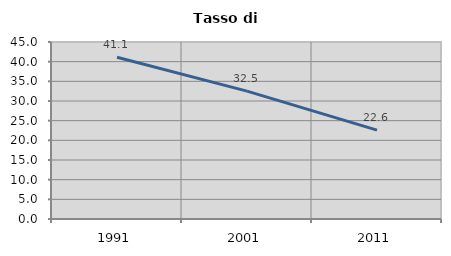
| Category | Tasso di disoccupazione   |
|---|---|
| 1991.0 | 41.118 |
| 2001.0 | 32.502 |
| 2011.0 | 22.599 |